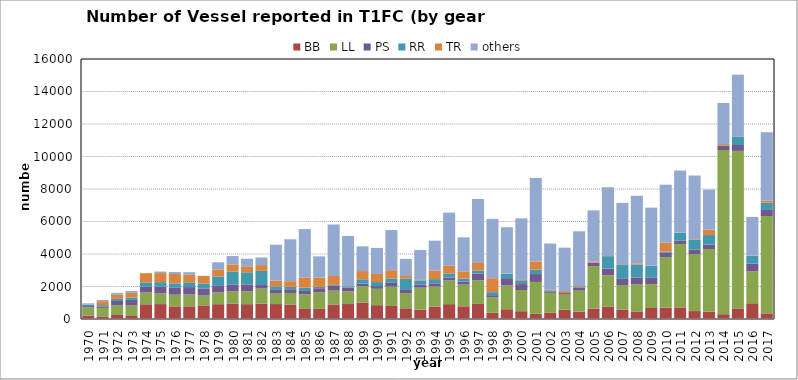
| Category | BB | LL | PS | RR | TR | others |
|---|---|---|---|---|---|---|
| 1970.0 | 214 | 503 | 79 | 91 | 0 | 74 |
| 1971.0 | 157 | 526 | 94 | 79 | 242 | 75 |
| 1972.0 | 247 | 602 | 262 | 129 | 250 | 117 |
| 1973.0 | 184 | 648 | 344 | 151 | 284 | 118 |
| 1974.0 | 905 | 731 | 350 | 269 | 568 | 0 |
| 1975.0 | 918 | 660 | 410 | 279 | 558 | 95 |
| 1976.0 | 776 | 720 | 422 | 274 | 578 | 125 |
| 1977.0 | 778 | 731 | 455 | 296 | 461 | 160 |
| 1978.0 | 838 | 608 | 435 | 306 | 465 | 5 |
| 1979.0 | 912 | 730 | 434 | 544 | 429 | 441 |
| 1980.0 | 935 | 765 | 406 | 819 | 430 | 519 |
| 1981.0 | 912 | 795 | 420 | 746 | 367 | 466 |
| 1982.0 | 950 | 920 | 220 | 870 | 361 | 464 |
| 1983.0 | 919 | 644 | 226 | 215 | 355 | 2213 |
| 1984.0 | 890 | 712 | 228 | 151 | 345 | 2580 |
| 1985.0 | 620 | 904 | 203 | 201 | 628 | 2976 |
| 1986.0 | 627 | 1014 | 252 | 83 | 571 | 1307 |
| 1987.0 | 896 | 851 | 295 | 59 | 547 | 3167 |
| 1988.0 | 921 | 776 | 233 | 81 | 16 | 3084 |
| 1989.0 | 1014 | 1001 | 160 | 269 | 505 | 1521 |
| 1990.0 | 851 | 1008 | 167 | 248 | 500 | 1602 |
| 1991.0 | 803 | 1185 | 235 | 260 | 519 | 2469 |
| 1992.0 | 661 | 921 | 205 | 698 | 161 | 1053 |
| 1993.0 | 573 | 1356 | 182 | 258 | 38 | 1838 |
| 1994.0 | 770 | 1228 | 198 | 258 | 523 | 1842 |
| 1995.0 | 914 | 1459 | 177 | 255 | 466 | 3276 |
| 1996.0 | 782 | 1337 | 176 | 192 | 444 | 2096 |
| 1997.0 | 927 | 1455 | 413 | 192 | 465 | 3936 |
| 1998.0 | 381 | 960 | 125 | 186 | 860 | 3649 |
| 1999.0 | 602 | 1459 | 452 | 266 | 18 | 2851 |
| 2000.0 | 480 | 1304 | 365 | 197 | 58 | 3789 |
| 2001.0 | 322 | 1958 | 485 | 274 | 501 | 5136 |
| 2002.0 | 401 | 1208 | 93 | 63 | 32 | 2847 |
| 2003.0 | 578 | 922 | 96 | 0 | 119 | 2675 |
| 2004.0 | 453 | 1293 | 190 | 41 | 53 | 3369 |
| 2005.0 | 637 | 2609 | 201 | 27 | 75 | 3137 |
| 2006.0 | 754 | 1942 | 407 | 764 | 13 | 4229 |
| 2007.0 | 580 | 1512 | 377 | 852 | 5 | 3821 |
| 2008.0 | 439 | 1692 | 424 | 789 | 83 | 4161 |
| 2009.0 | 676 | 1469 | 388 | 742 | 5 | 3573 |
| 2010.0 | 700 | 3109 | 264 | 78 | 546 | 3566 |
| 2011.0 | 714 | 3898 | 223 | 464 | 10 | 3828 |
| 2012.0 | 488 | 3513 | 264 | 612 | 35 | 3918 |
| 2013.0 | 451 | 3858 | 274 | 582 | 341 | 2459 |
| 2014.0 | 297 | 10102 | 268 | 26 | 74 | 2524 |
| 2015.0 | 651 | 9696 | 362 | 489 | 8 | 3830 |
| 2016.0 | 968 | 1977 | 470 | 471 | 22 | 2375 |
| 2017.0 | 348 | 5990 | 373 | 447 | 117 | 4214 |